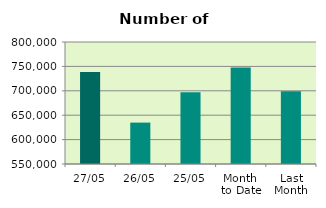
| Category | Series 0 |
|---|---|
| 27/05 | 738326 |
| 26/05 | 634850 |
| 25/05 | 697262 |
| Month 
to Date | 747630.105 |
| Last
Month | 699227 |